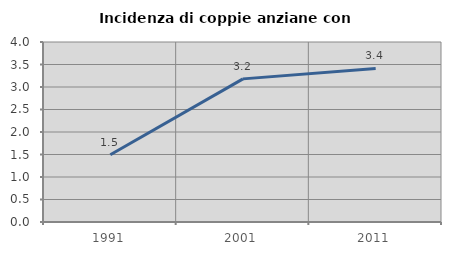
| Category | Incidenza di coppie anziane con figli |
|---|---|
| 1991.0 | 1.494 |
| 2001.0 | 3.18 |
| 2011.0 | 3.413 |